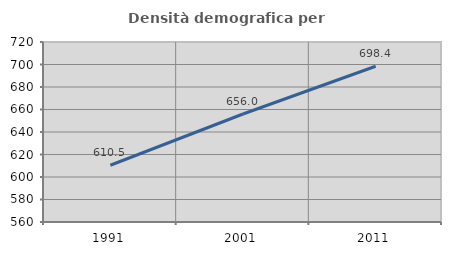
| Category | Densità demografica |
|---|---|
| 1991.0 | 610.463 |
| 2001.0 | 656.02 |
| 2011.0 | 698.43 |